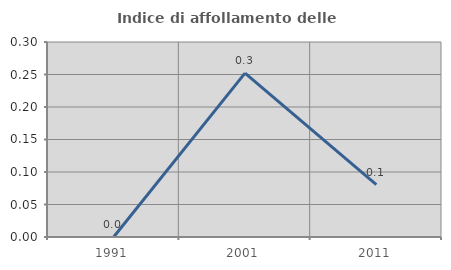
| Category | Indice di affollamento delle abitazioni  |
|---|---|
| 1991.0 | 0 |
| 2001.0 | 0.252 |
| 2011.0 | 0.08 |